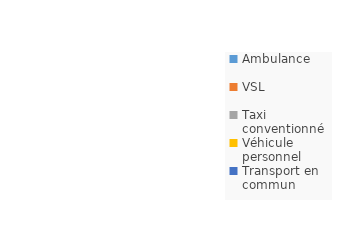
| Category | Series 0 |
|---|---|
| Ambulance | 0 |
| VSL | 0 |
| Taxi conventionné | 0 |
| Véhicule personnel | 0 |
| Transport en commun | 0 |